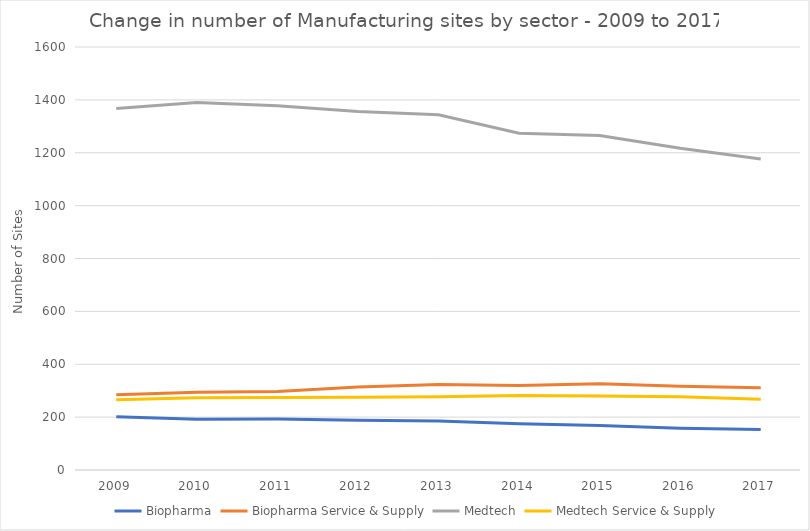
| Category | Biopharma | Biopharma Service & Supply | Medtech | Medtech Service & Supply |
|---|---|---|---|---|
| 2009 | 201 | 285 | 1367 | 266 |
| 2010 | 192 | 294 | 1390 | 273 |
| 2011 | 193 | 297 | 1378 | 274 |
| 2012 | 188 | 314 | 1356 | 275 |
| 2013 | 185 | 323 | 1344 | 277 |
| 2014 | 175 | 320 | 1274 | 282 |
| 2015 | 168 | 326 | 1265 | 280 |
| 2016 | 158 | 317 | 1217 | 277 |
| 2017 | 153 | 311 | 1176 | 268 |